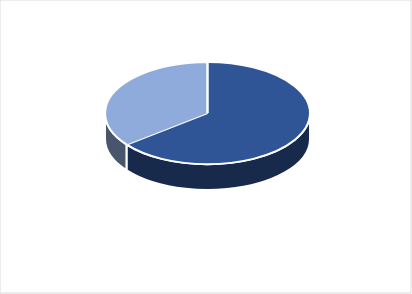
| Category | Series 0 |
|---|---|
| PRESUPUESTO VIGENTE PARA 2023 | 26648782 |
| PRESUPUESTO EJECUTADO  | 14707773.03 |
| PORCENTAJE DE EJECUCIÓN  | 0.552 |